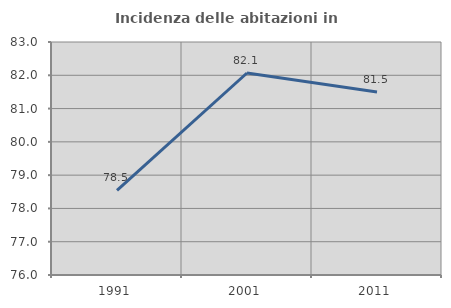
| Category | Incidenza delle abitazioni in proprietà  |
|---|---|
| 1991.0 | 78.544 |
| 2001.0 | 82.069 |
| 2011.0 | 81.496 |